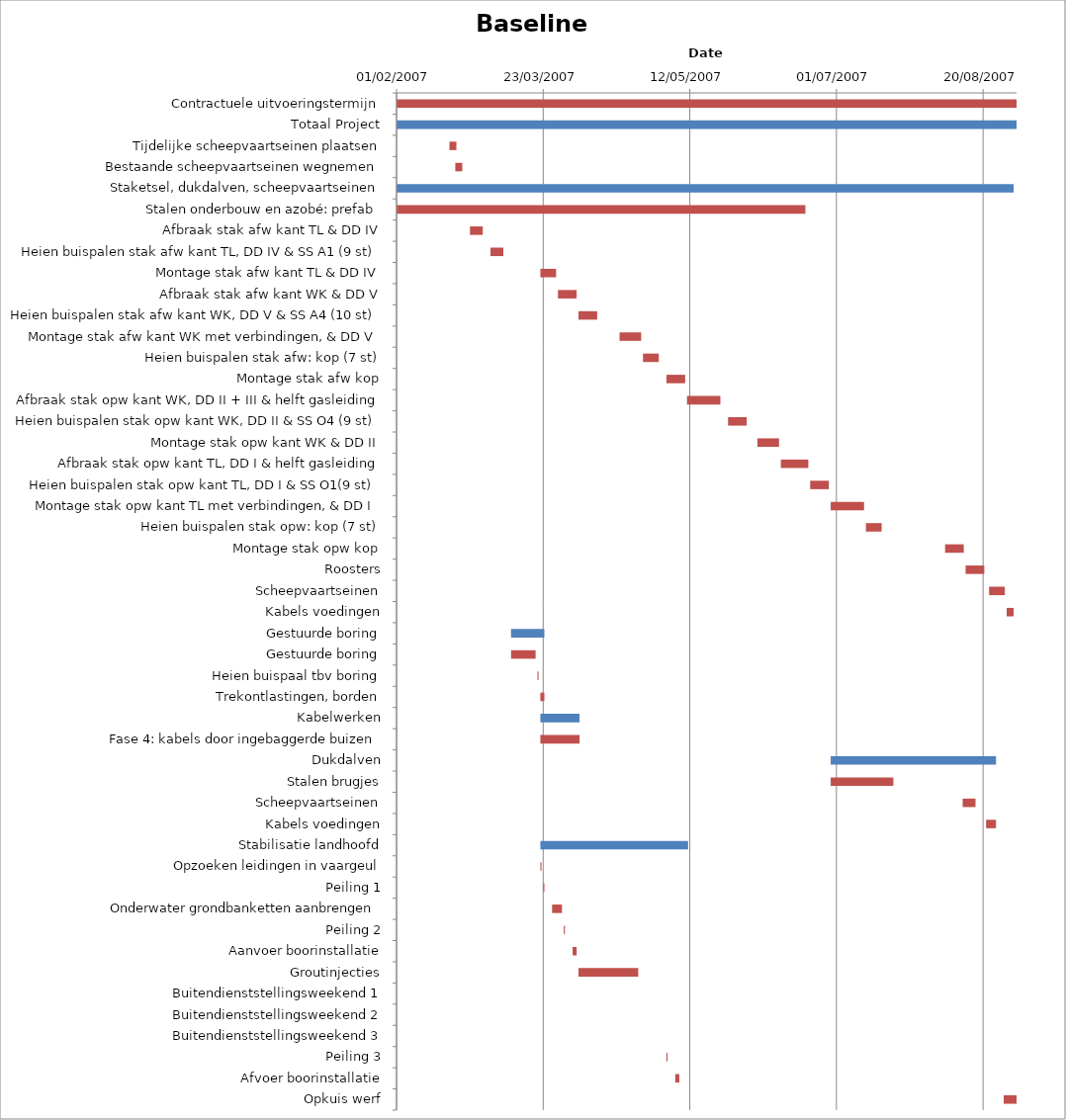
| Category | Baseline start | Actual duration |
|---|---|---|
| Contractuele uitvoeringstermijn | 39114.333 | 211.375 |
| Totaal Project | 39114.333 | 211.375 |
| Tijdelijke scheepvaartseinen plaatsen | 39132.333 | 2.375 |
| Bestaande scheepvaartseinen wegnemen | 39134.333 | 2.375 |
| Staketsel, dukdalven, scheepvaartseinen | 39114.333 | 210.375 |
| Stalen onderbouw en azobé: prefab | 39114.333 | 139.375 |
| Afbraak stak afw kant TL & DD IV | 39139.333 | 4.375 |
| Heien buispalen stak afw kant TL, DD IV & SS A1 (9 st) | 39146.333 | 4.375 |
| Montage stak afw kant TL & DD IV | 39163.333 | 5.375 |
| Afbraak stak afw kant WK & DD V | 39169.333 | 6.375 |
| Heien buispalen stak afw kant WK, DD V & SS A4 (10 st) | 39176.333 | 6.375 |
| Montage stak afw kant WK met verbindingen, & DD V | 39190.333 | 7.375 |
| Heien buispalen stak afw: kop (7 st) | 39198.333 | 5.375 |
| Montage stak afw kop | 39206.333 | 6.375 |
| Afbraak stak opw kant WK, DD II + III & helft gasleiding | 39213.333 | 11.375 |
| Heien buispalen stak opw kant WK, DD II & SS O4 (9 st) | 39227.333 | 6.375 |
| Montage stak opw kant WK & DD II | 39237.333 | 7.375 |
| Afbraak stak opw kant TL, DD I & helft gasleiding | 39245.333 | 9.375 |
| Heien buispalen stak opw kant TL, DD I & SS O1(9 st) | 39255.333 | 6.375 |
| Montage stak opw kant TL met verbindingen, & DD I | 39262.333 | 11.375 |
| Heien buispalen stak opw: kop (7 st) | 39274.333 | 5.375 |
| Montage stak opw kop | 39301.333 | 6.375 |
| Roosters | 39308.333 | 6.375 |
| Scheepvaartseinen | 39316.333 | 5.375 |
| Kabels voedingen | 39322.333 | 2.375 |
| Gestuurde boring | 39153.333 | 11.375 |
| Gestuurde boring | 39153.333 | 8.375 |
| Heien buispaal tbv boring | 39162.333 | 0.375 |
| Trekontlastingen, borden | 39163.333 | 1.375 |
| Kabelwerken | 39163.333 | 13.375 |
| Fase 4: kabels door ingebaggerde buizen | 39163.333 | 13.375 |
| Dukdalven | 39262.333 | 56.375 |
| Stalen brugjes | 39262.333 | 21.375 |
| Scheepvaartseinen | 39307.333 | 4.375 |
| Kabels voedingen | 39315.333 | 3.375 |
| Stabilisatie landhoofd | 39163.333 | 50.375 |
| Opzoeken leidingen in vaargeul | 39163.333 | 0.375 |
| Peiling 1 | 39164.333 | 0.375 |
| Onderwater grondbanketten aanbrengen | 39167.333 | 3.375 |
| Peiling 2 | 39171.333 | 0.375 |
| Aanvoer boorinstallatie | 39174.333 | 1.375 |
| Groutinjecties | 39176.333 | 20.375 |
| Buitendienststellingsweekend 1 | 39199.708 | 0 |
| Buitendienststellingsweekend 2 | 39206.708 | 0 |
| Buitendienststellingsweekend 3 | 39213.708 | 0 |
| Peiling 3 | 39206.333 | 0.375 |
| Afvoer boorinstallatie | 39209.333 | 1.375 |
| Opkuis werf | 39321.333 | 4.375 |